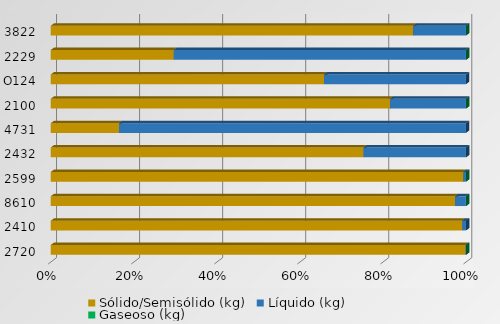
| Category | Sólido/Semisólido (kg) | Líquido (kg) | Gaseoso (kg) |
|---|---|---|---|
| 2720 | 4618063.7 | 4217 | 0 |
| 2410 | 3530053.4 | 31964 | 0 |
| 8610 | 801178.28 | 21493.21 | 86 |
| 2599 | 745183.61 | 4696.8 | 0 |
| 2432 | 432518.42 | 141631 | 0 |
| 4731 | 85720.14 | 435374.52 | 0 |
| 2100 | 414177.35 | 92609.16 | 0 |
| O124 | 313051.4 | 162526.2 | 0 |
| 2229 | 98406.72 | 233763.5 | 0 |
| 3822 | 274290 | 40022.15 | 0 |